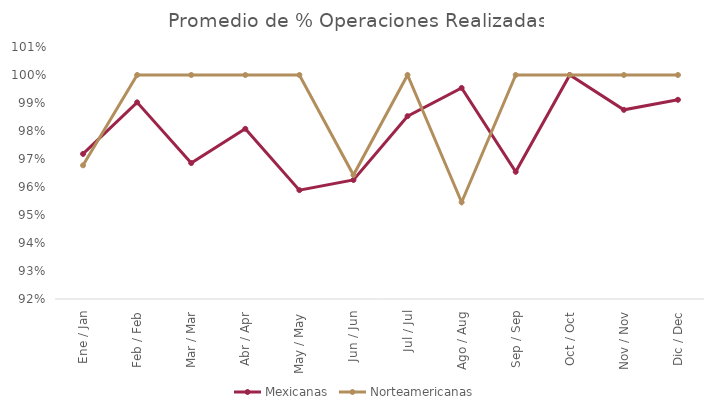
| Category | Mexicanas | Norteamericanas |
|---|---|---|
| Ene / Jan | 0.972 | 0.968 |
| Feb / Feb | 0.99 | 1 |
| Mar / Mar | 0.969 | 1 |
| Abr / Apr | 0.981 | 1 |
| May / May | 0.959 | 1 |
| Jun / Jun | 0.963 | 0.964 |
| Jul / Jul | 0.985 | 1 |
| Ago / Aug | 0.995 | 0.955 |
| Sep / Sep | 0.965 | 1 |
| Oct / Oct | 1 | 1 |
| Nov / Nov | 0.988 | 1 |
| Dic / Dec | 0.991 | 1 |